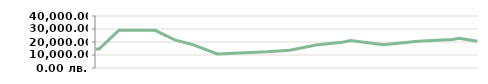
| Category | МЕСЕЦ   |
|---|---|
| 2013-04-23 | 14600 |
| 2013-04-25 | 14600 |
| 2013-05-07 | 29000 |
| 2013-05-14 | 29000 |
| 2013-05-14 | 29000 |
| 2013-05-29 | 29000 |
| 2013-06-10 | 21600 |
| 2013-06-21 | 17950 |
| 2013-07-06 | 10776.471 |
| 2013-08-05 | 12455.862 |
| 2013-08-19 | 13667.568 |
| 2013-09-04 | 17651.667 |
| 2013-09-20 | 19877.912 |
| 2013-09-25 | 21138.05 |
| 2013-10-15 | 17951.744 |
| 2013-11-05 | 20556.13 |
| 2013-11-26 | 21997.139 |
| 2013-11-30 | 22917.635 |
| 2013-12-11 | 20504.315 |